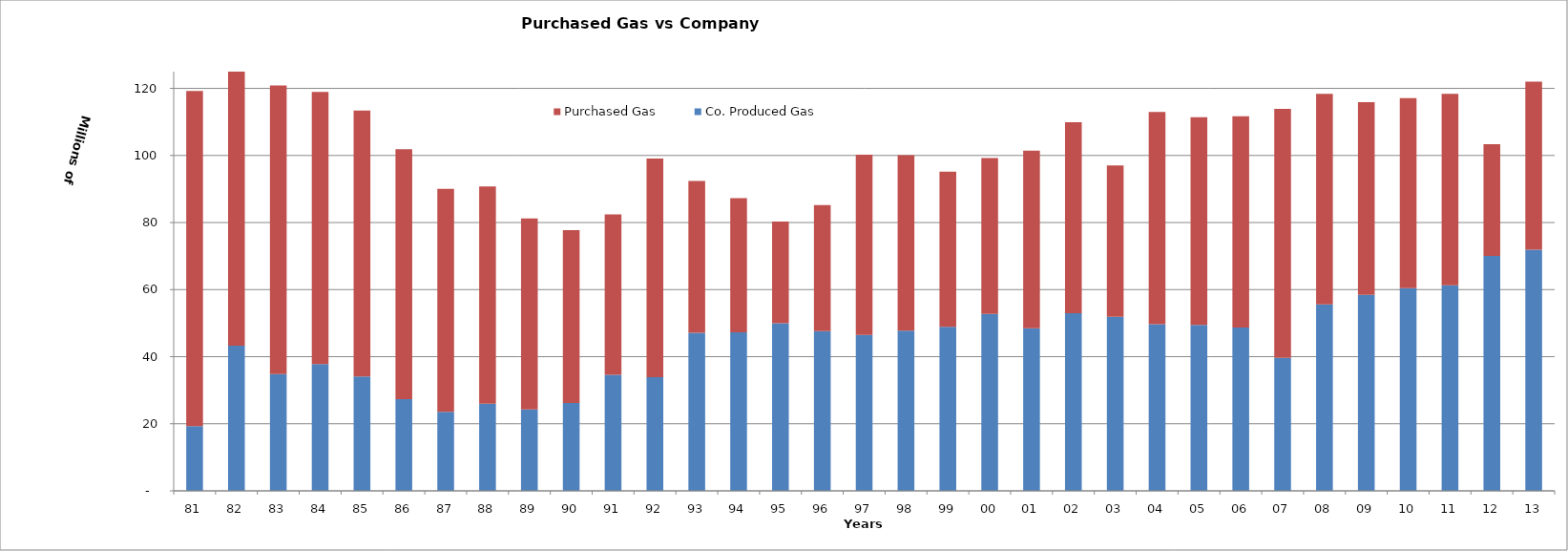
| Category | Co. Produced Gas | Purchased Gas |
|---|---|---|
| 81 | 19314840 | 99923224.286 |
| 82 | 43246998.15 | 83355155.932 |
| 83 | 34826991 | 86058364.102 |
| 84 | 37820993.55 | 81135632.3 |
| 85 | 34069999.65 | 79338914.22 |
| 86 | 27368998.35 | 74494419 |
| 87 | 23591997.15 | 66421173 |
| 88 | 26008993.35 | 64729329 |
| 89 | 24293001.45 | 56923090 |
| 90 | 26213995.2 | 51484195 |
| 91 | 34580997.3 | 47885156 |
| 92 | 33882996.3 | 65203726.94 |
| 93 | 47120999.55 | 45285386 |
| 94 | 47276415 | 39990856 |
| 95 | 49990035 | 30336637 |
| 96 | 47625735 | 37575715 |
| 97 | 46503000 | 53734600 |
| 98 | 47764000 | 52313902 |
| 99 | 48895000 | 46249773 |
| 00 | 52781000 | 46425578 |
| 01 | 48475000 | 52979036 |
| 02 | 52970000 | 56912695 |
| 03 | 51885000 | 45115003 |
| 04 | 49694000 | 63287064 |
| 05 | 49481000 | 61950995 |
| 06 | 48701000 | 63003039 |
| 07 | 39670000 | 74222918 |
| 08 | 55576000 | 62828533 |
| 09 | 58432000 | 57448633 |
| 10 | 60422000 | 56643058 |
| 11 | 61306000 | 57100064 |
| 12 | 70015000 | 33372542 |
| 13 | 71916000 | 50085436 |